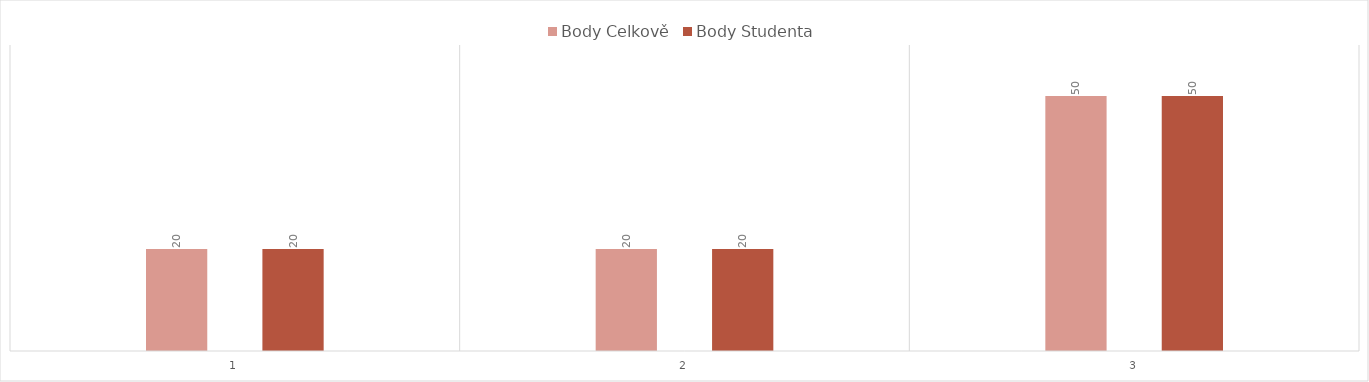
| Category | Body Celkově | Body Studenta |
|---|---|---|
| 0 | 20 | 20 |
| 1 | 20 | 20 |
| 2 | 50 | 50 |